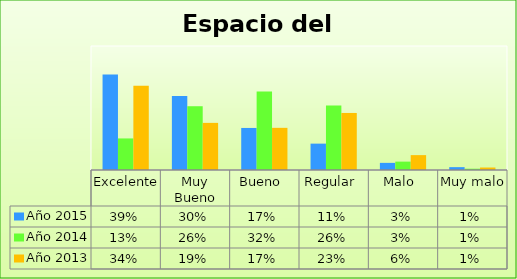
| Category | Año 2015 | Año 2014 | Año 2013 |
|---|---|---|---|
| Excelente | 0.385 | 0.127 | 0.34 |
| Muy Bueno | 0.299 | 0.257 | 0.19 |
| Bueno  | 0.17 | 0.317 | 0.17 |
| Regular  | 0.106 | 0.26 | 0.23 |
| Malo  | 0.029 | 0.034 | 0.06 |
| Muy malo  | 0.011 | 0.005 | 0.01 |